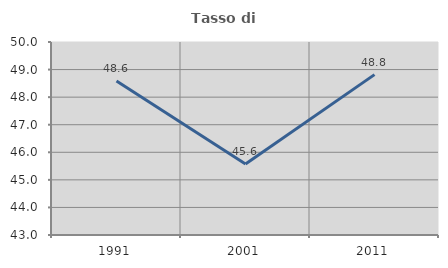
| Category | Tasso di occupazione   |
|---|---|
| 1991.0 | 48.586 |
| 2001.0 | 45.572 |
| 2011.0 | 48.816 |